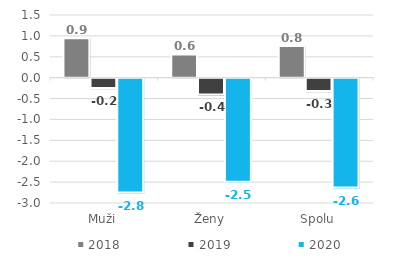
| Category | 2018 | 2019 | 2020 |
|---|---|---|---|
| Muži | 0.942 | -0.25 | -2.751 |
| Ženy | 0.556 | -0.403 | -2.494 |
| Spolu | 0.759 | -0.322 | -2.63 |